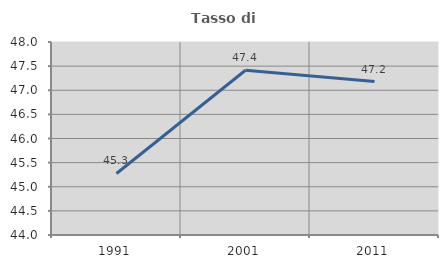
| Category | Tasso di occupazione   |
|---|---|
| 1991.0 | 45.275 |
| 2001.0 | 47.415 |
| 2011.0 | 47.181 |